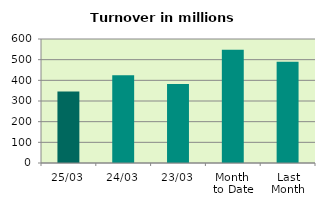
| Category | Series 0 |
|---|---|
| 25/03 | 345.815 |
| 24/03 | 424.942 |
| 23/03 | 382.636 |
| Month 
to Date | 547.822 |
| Last
Month | 490.433 |